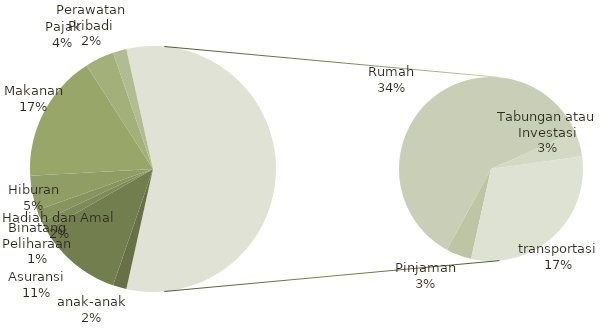
| Category | Total |
|---|---|
| anak-anak | 140 |
| Asuransi | 900 |
| Binatang Peliharaan | 100 |
| Hadiah dan Amal | 125 |
| Hiburan | 358 |
| Makanan | 1320 |
| Pajak | 300 |
| Perawatan Pribadi | 140 |
| Pinjaman | 200 |
| Rumah | 2702 |
| Tabungan atau Investasi | 200 |
| transportasi | 1375 |